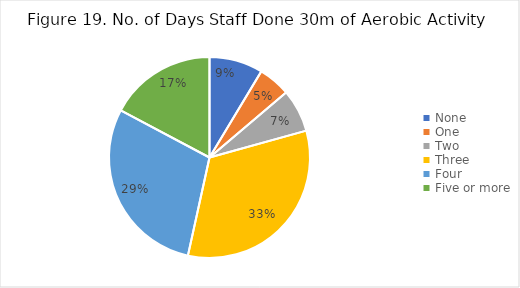
| Category | Series 0 |
|---|---|
| None | 0.086 |
| One | 0.052 |
| Two | 0.069 |
| Three | 0.328 |
| Four | 0.293 |
| Five or more | 0.172 |